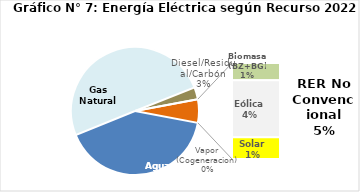
| Category | Series 0 |
|---|---|
| Agua | 2042.113 |
| Gas Natural | 2504.759 |
| Diesel/Residual/Carbón | 151.125 |
| Vapor (Cogeneracion) | 0.108 |
| Biomasa (BZ+BG) | 53.271 |
| Eólica | 175.873 |
| Solar | 67.429 |